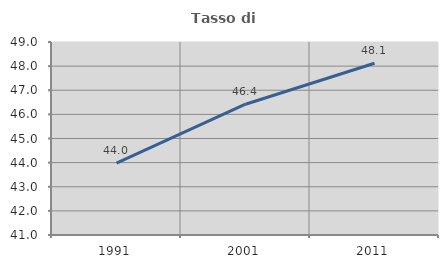
| Category | Tasso di occupazione   |
|---|---|
| 1991.0 | 43.975 |
| 2001.0 | 46.42 |
| 2011.0 | 48.121 |